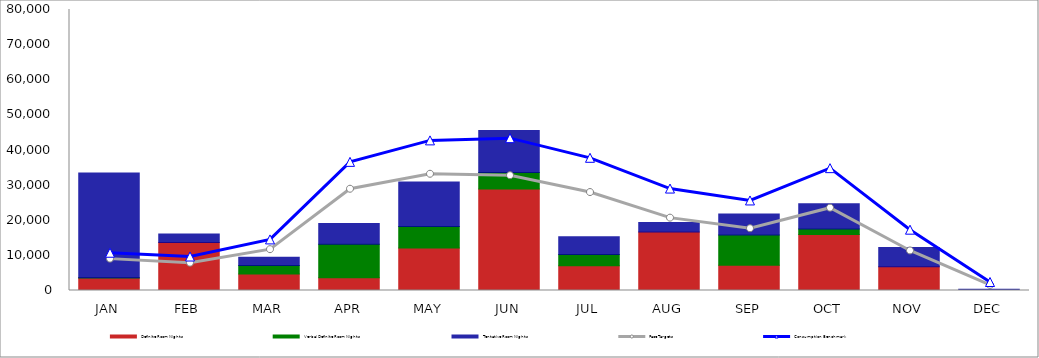
| Category | Definite Room Nights | Verbal Definite Room Nights | Tentative Room Nights |
|---|---|---|---|
| JAN | 3541 | 60 | 29822 |
| FEB | 13690 | 0 | 2377 |
| MAR | 4697 | 2441 | 2345 |
| APR | 3660 | 9518 | 5883 |
| MAY | 12074 | 6173 | 12623 |
| JUN | 28918 | 4683 | 11973 |
| JUL | 7063 | 3160 | 5076 |
| AUG | 16663 | 0 | 2700 |
| SEP | 7208 | 8595 | 5993 |
| OCT | 15923 | 1580 | 7170 |
| NOV | 6788 | 0 | 5477 |
| DEC | 0 | 0 | 350 |